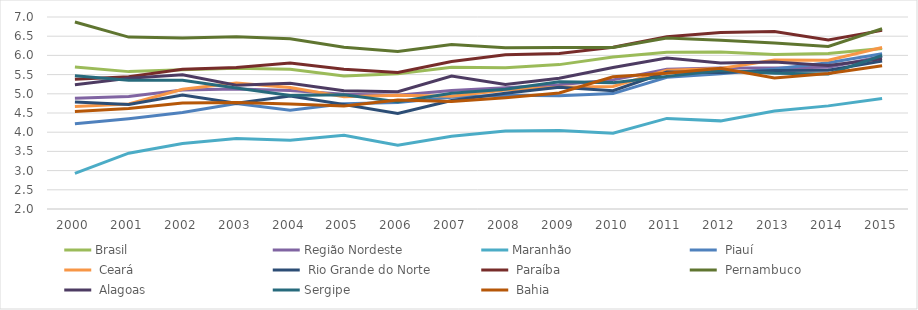
| Category | Brasil | Região Nordeste | Maranhão |  Piauí |  Ceará |  Rio Grande do Norte |  Paraíba |  Pernambuco |  Alagoas | Sergipe |  Bahia |
|---|---|---|---|---|---|---|---|---|---|---|---|
| 2000.0 | 5.699 | 4.884 | 2.927 | 4.221 | 4.672 | 4.789 | 5.377 | 6.869 | 5.236 | 5.468 | 4.542 |
| 2001.0 | 5.578 | 4.93 | 3.454 | 4.353 | 4.733 | 4.721 | 5.443 | 6.477 | 5.406 | 5.352 | 4.618 |
| 2002.0 | 5.628 | 5.097 | 3.703 | 4.515 | 5.117 | 4.969 | 5.638 | 6.456 | 5.493 | 5.35 | 4.76 |
| 2003.0 | 5.667 | 5.127 | 3.835 | 4.748 | 5.281 | 4.754 | 5.684 | 6.483 | 5.225 | 5.148 | 4.771 |
| 2004.0 | 5.64 | 5.089 | 3.79 | 4.569 | 5.162 | 4.943 | 5.8 | 6.434 | 5.276 | 4.959 | 4.735 |
| 2005.0 | 5.466 | 4.989 | 3.921 | 4.74 | 4.924 | 4.719 | 5.642 | 6.21 | 5.077 | 4.974 | 4.682 |
| 2006.0 | 5.524 | 4.963 | 3.661 | 4.77 | 4.964 | 4.488 | 5.557 | 6.102 | 5.055 | 4.791 | 4.841 |
| 2007.0 | 5.694 | 5.088 | 3.893 | 4.908 | 4.939 | 4.825 | 5.843 | 6.285 | 5.464 | 5.015 | 4.8 |
| 2008.0 | 5.68 | 5.159 | 4.029 | 4.965 | 5.1 | 5.014 | 6.018 | 6.197 | 5.245 | 5.121 | 4.897 |
| 2009.0 | 5.76 | 5.234 | 4.042 | 4.951 | 5.17 | 5.168 | 6.047 | 6.206 | 5.404 | 5.316 | 5.021 |
| 2010.0 | 5.961 | 5.363 | 3.971 | 5.006 | 5.19 | 5.079 | 6.214 | 6.204 | 5.683 | 5.291 | 5.444 |
| 2011.0 | 6.084 | 5.637 | 4.359 | 5.43 | 5.614 | 5.565 | 6.483 | 6.455 | 5.932 | 5.454 | 5.536 |
| 2012.0 | 6.089 | 5.672 | 4.295 | 5.521 | 5.66 | 5.552 | 6.597 | 6.397 | 5.805 | 5.608 | 5.666 |
| 2013.0 | 6.02 | 5.671 | 4.551 | 5.648 | 5.882 | 5.608 | 6.623 | 6.321 | 5.83 | 5.534 | 5.412 |
| 2014.0 | 6.051 | 5.691 | 4.686 | 5.811 | 5.875 | 5.614 | 6.4 | 6.232 | 5.739 | 5.513 | 5.529 |
| 2015.0 | 6.182 | 5.971 | 4.876 | 6.044 | 6.206 | 5.855 | 6.652 | 6.694 | 5.913 | 5.998 | 5.728 |